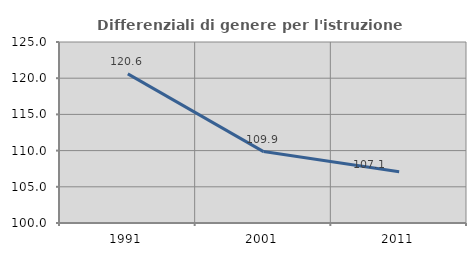
| Category | Differenziali di genere per l'istruzione superiore |
|---|---|
| 1991.0 | 120.592 |
| 2001.0 | 109.865 |
| 2011.0 | 107.084 |